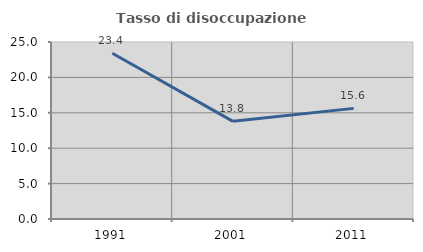
| Category | Tasso di disoccupazione giovanile  |
|---|---|
| 1991.0 | 23.404 |
| 2001.0 | 13.793 |
| 2011.0 | 15.625 |